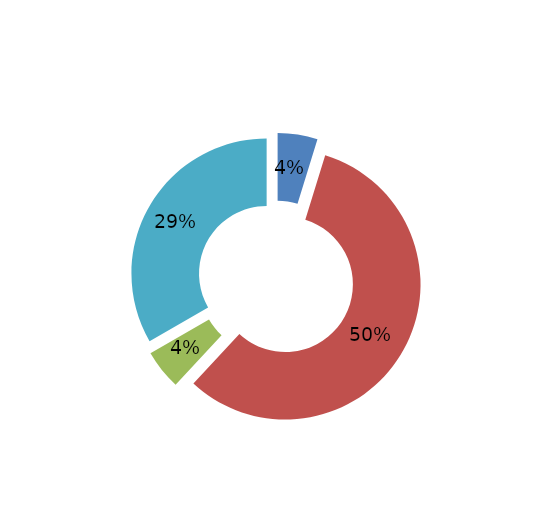
| Category | Series 0 |
|---|---|
| Empleado de empresa familiar sin remuneración | 0.042 |
| Empleado de empresa particular | 0.5 |
| Empleado del gobierno | 0.042 |
| Empresario/Empleador | 0 |
| Trabajador independiente (Sector público o privado) | 0.292 |